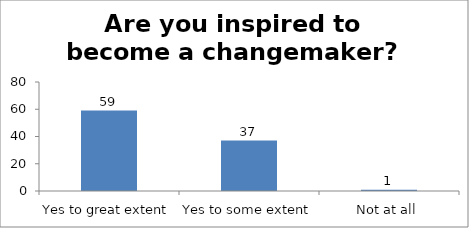
| Category | Are you inspired to become a changemaker?   |
|---|---|
| Yes to great extent | 59 |
| Yes to some extent | 37 |
| Not at all | 1 |